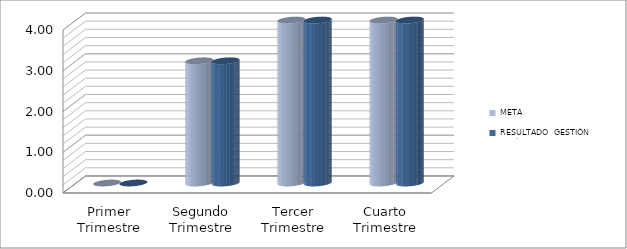
| Category | META | RESULTADO  GESTIÓN PERÍODO |
|---|---|---|
| Primer Trimestre | 0 | 0 |
| Segundo Trimestre | 3 | 3 |
| Tercer Trimestre | 5 | 5 |
| Cuarto Trimestre | 11 | 11 |